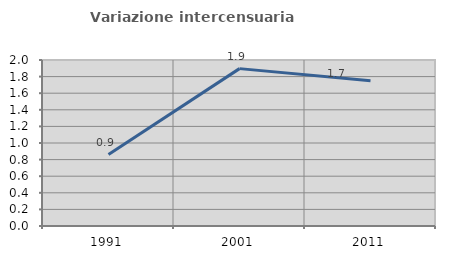
| Category | Variazione intercensuaria annua |
|---|---|
| 1991.0 | 0.861 |
| 2001.0 | 1.896 |
| 2011.0 | 1.749 |